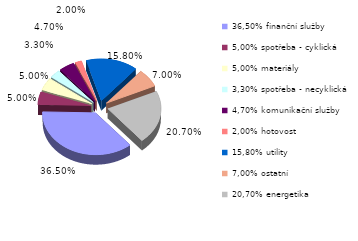
| Category | Series 0 |
|---|---|
| 36,50% finanční služby | 0.365 |
| 5,00% spotřeba - cyklická | 0.05 |
| 5,00% materiály | 0.05 |
| 3,30% spotřeba - necyklická | 0.033 |
| 4,70% komunikační služby | 0.047 |
| 2,00% hotovost | 0.02 |
| 15,80% utility | 0.158 |
| 7,00% ostatní | 0.07 |
| 20,70% energetika | 0.207 |